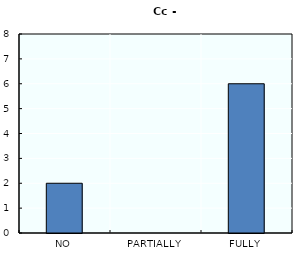
| Category | Series 0 |
|---|---|
| NO | 2 |
| PARTIALLY | 0 |
| FULLY | 6 |